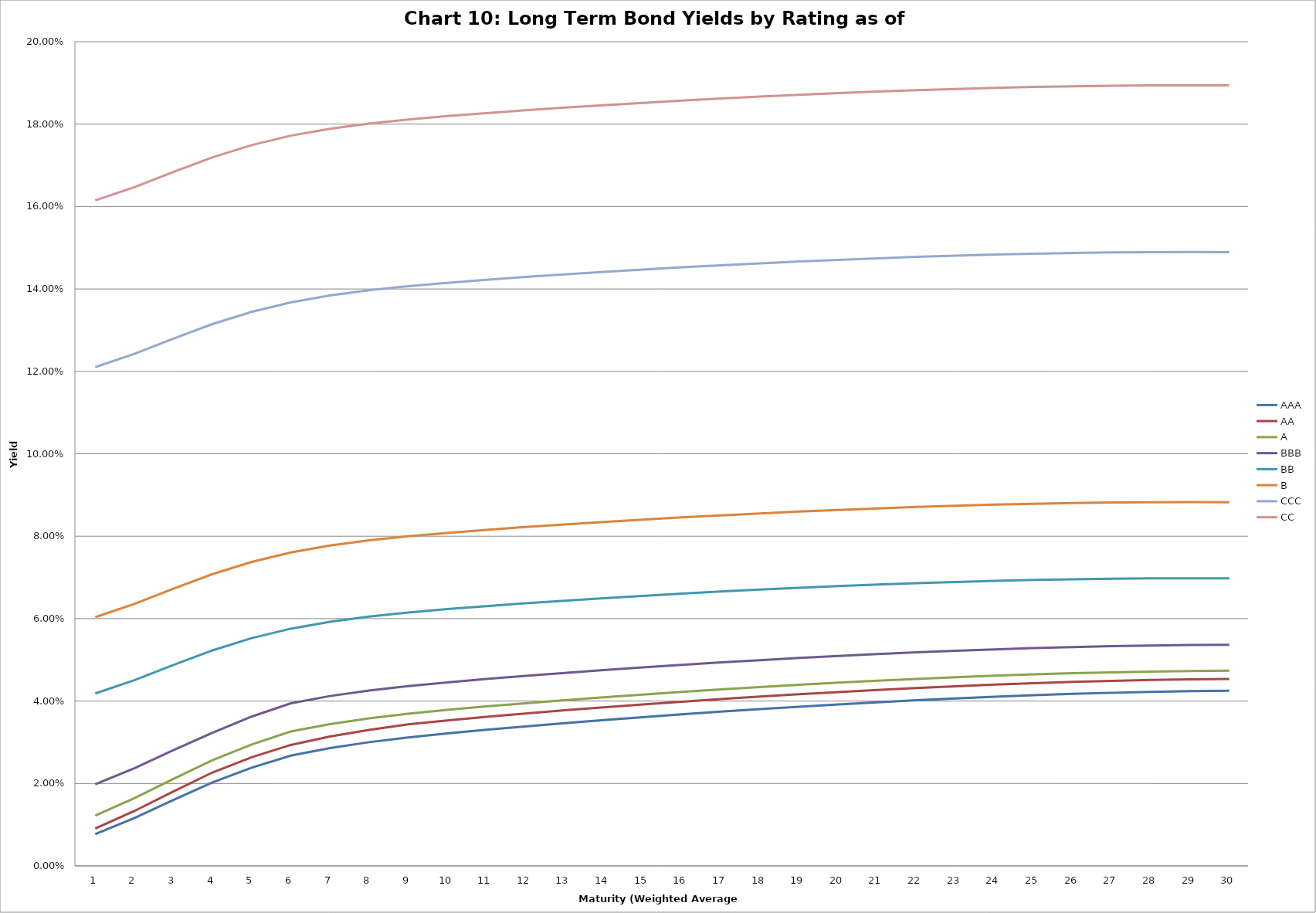
| Category | AAA | AA | A | BBB | BB | B | CCC | CC |
|---|---|---|---|---|---|---|---|---|
| 0 | 0.008 | 0.009 | 0.012 | 0.02 | 0.042 | 0.06 | 0.121 | 0.161 |
| 1 | 0.012 | 0.013 | 0.016 | 0.024 | 0.045 | 0.064 | 0.124 | 0.165 |
| 2 | 0.016 | 0.018 | 0.021 | 0.028 | 0.049 | 0.067 | 0.128 | 0.168 |
| 3 | 0.02 | 0.023 | 0.026 | 0.032 | 0.052 | 0.071 | 0.131 | 0.172 |
| 4 | 0.024 | 0.026 | 0.029 | 0.036 | 0.055 | 0.074 | 0.134 | 0.175 |
| 5 | 0.027 | 0.029 | 0.033 | 0.039 | 0.058 | 0.076 | 0.137 | 0.177 |
| 6 | 0.029 | 0.031 | 0.034 | 0.041 | 0.059 | 0.078 | 0.138 | 0.179 |
| 7 | 0.03 | 0.033 | 0.036 | 0.043 | 0.06 | 0.079 | 0.14 | 0.18 |
| 8 | 0.031 | 0.034 | 0.037 | 0.044 | 0.061 | 0.08 | 0.141 | 0.181 |
| 9 | 0.032 | 0.035 | 0.038 | 0.045 | 0.062 | 0.081 | 0.141 | 0.182 |
| 10 | 0.033 | 0.036 | 0.039 | 0.045 | 0.063 | 0.082 | 0.142 | 0.183 |
| 11 | 0.034 | 0.037 | 0.039 | 0.046 | 0.064 | 0.082 | 0.143 | 0.183 |
| 12 | 0.035 | 0.038 | 0.04 | 0.047 | 0.064 | 0.083 | 0.144 | 0.184 |
| 13 | 0.035 | 0.038 | 0.041 | 0.048 | 0.065 | 0.083 | 0.144 | 0.185 |
| 14 | 0.036 | 0.039 | 0.042 | 0.048 | 0.066 | 0.084 | 0.145 | 0.185 |
| 15 | 0.037 | 0.04 | 0.042 | 0.049 | 0.066 | 0.085 | 0.145 | 0.186 |
| 16 | 0.037 | 0.04 | 0.043 | 0.049 | 0.067 | 0.085 | 0.146 | 0.186 |
| 17 | 0.038 | 0.041 | 0.043 | 0.05 | 0.067 | 0.086 | 0.146 | 0.187 |
| 18 | 0.039 | 0.042 | 0.044 | 0.05 | 0.067 | 0.086 | 0.147 | 0.187 |
| 19 | 0.039 | 0.042 | 0.044 | 0.051 | 0.068 | 0.086 | 0.147 | 0.188 |
| 20 | 0.04 | 0.043 | 0.045 | 0.051 | 0.068 | 0.087 | 0.147 | 0.188 |
| 21 | 0.04 | 0.043 | 0.045 | 0.052 | 0.069 | 0.087 | 0.148 | 0.188 |
| 22 | 0.041 | 0.044 | 0.046 | 0.052 | 0.069 | 0.087 | 0.148 | 0.189 |
| 23 | 0.041 | 0.044 | 0.046 | 0.053 | 0.069 | 0.088 | 0.148 | 0.189 |
| 24 | 0.041 | 0.044 | 0.046 | 0.053 | 0.069 | 0.088 | 0.149 | 0.189 |
| 25 | 0.042 | 0.045 | 0.047 | 0.053 | 0.07 | 0.088 | 0.149 | 0.189 |
| 26 | 0.042 | 0.045 | 0.047 | 0.053 | 0.07 | 0.088 | 0.149 | 0.189 |
| 27 | 0.042 | 0.045 | 0.047 | 0.053 | 0.07 | 0.088 | 0.149 | 0.189 |
| 28 | 0.042 | 0.045 | 0.047 | 0.054 | 0.07 | 0.088 | 0.149 | 0.189 |
| 29 | 0.043 | 0.045 | 0.047 | 0.054 | 0.07 | 0.088 | 0.149 | 0.189 |